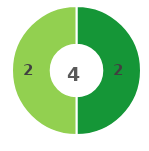
| Category | Series 0 |
|---|---|
| 0 | 2 |
| 1 | 2 |
| 2 | 0 |
| 3 | 0 |
| 4 | 0 |